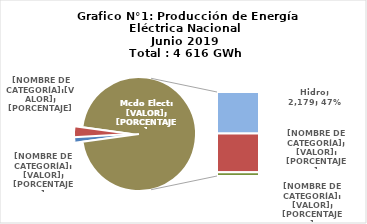
| Category | Series 0 |
|---|---|
| 0 | 60.932 |
| 1 | 142.174 |
| 2 | 2178.801 |
| 3 | 2033.362 |
| 4 | 200.756 |